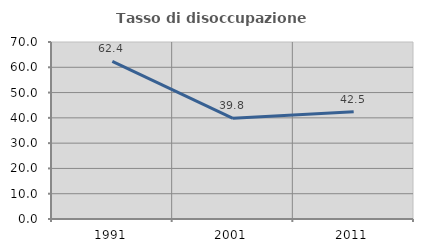
| Category | Tasso di disoccupazione giovanile  |
|---|---|
| 1991.0 | 62.35 |
| 2001.0 | 39.834 |
| 2011.0 | 42.462 |